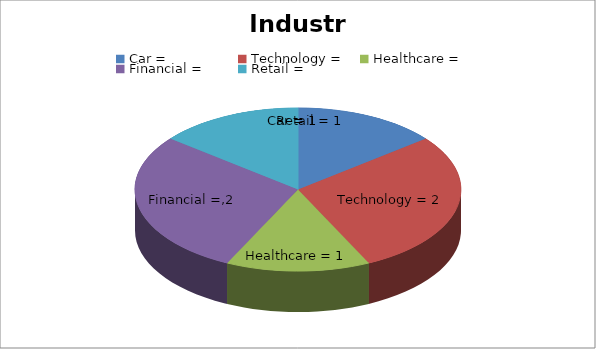
| Category | Stock Industry |
|---|---|
| 0 | 1 |
| 1 | 2 |
| 2 | 1 |
| 3 | 2 |
| 4 | 1 |